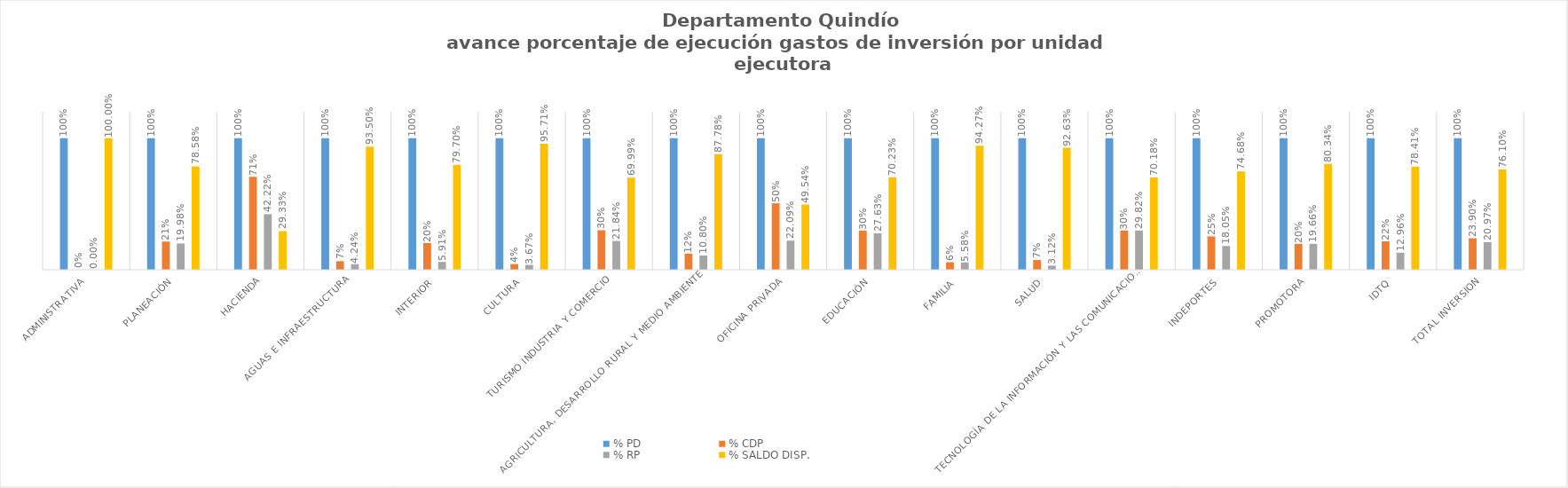
| Category | % PD | % CDP | % RP | % SALDO DISP. |
|---|---|---|---|---|
| Administrativa | 1 | 0 | 0 | 1 |
| Planeación | 1 | 0.214 | 0.2 | 0.786 |
| Hacienda | 1 | 0.707 | 0.422 | 0.293 |
| Aguas e Infraestructura | 1 | 0.065 | 0.042 | 0.935 |
| Interior | 1 | 0.203 | 0.059 | 0.797 |
| Cultura | 1 | 0.043 | 0.037 | 0.957 |
| Turismo Industria y Comercio | 1 | 0.3 | 0.218 | 0.7 |
| Agricultura, Desarrollo Rural y Medio Ambiente | 1 | 0.122 | 0.108 | 0.878 |
| Oficina Privada | 1 | 0.505 | 0.221 | 0.495 |
| Educación | 1 | 0.298 | 0.276 | 0.702 |
| Familia | 1 | 0.057 | 0.056 | 0.943 |
| Salud | 1 | 0.074 | 0.031 | 0.926 |
| Tecnología de la Información y las Comunicaciones | 1 | 0.298 | 0.298 | 0.702 |
| Indeportes | 1 | 0.253 | 0.181 | 0.747 |
| Promotora | 1 | 0.197 | 0.197 | 0.803 |
| IDTQ | 1 | 0.216 | 0.13 | 0.784 |
| TOTAL INVERSION | 1 | 0.239 | 0.21 | 0.761 |